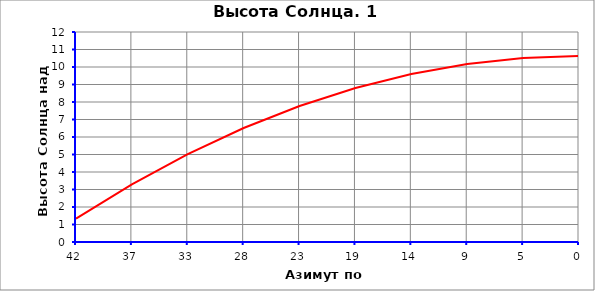
| Category | Series 0 |
|---|---|
| 42.15604257340312 | 1.333 |
| 37.47203784302499 | 3.29 |
| 32.788033112646865 | 5.017 |
| 28.10402838226874 | 6.512 |
| 23.420023651890617 | 7.773 |
| 18.736018921512493 | 8.803 |
| 14.052014191134369 | 9.601 |
| 9.368009460756245 | 10.169 |
| 4.68400473037812 | 10.51 |
| 0.0 | 10.624 |